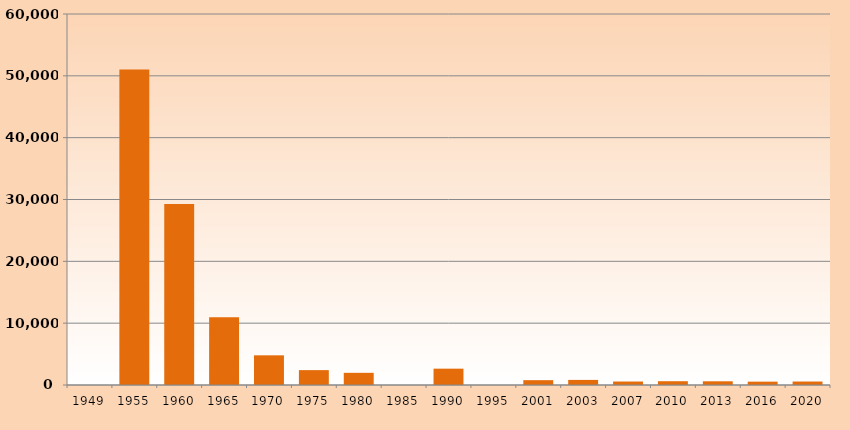
| Category | Series 1 |
|---|---|
| 1949.0 | 0 |
| 1955.0 | 51026 |
| 1960.0 | 29266 |
| 1965.0 | 10964 |
| 1970.0 | 4799 |
| 1975.0 | 2405 |
| 1980.0 | 1971 |
| 1985.0 | 0 |
| 1990.0 | 2642 |
| 1995.0 | 0 |
| 2001.0 | 781 |
| 2003.0 | 823 |
| 2007.0 | 561 |
| 2010.0 | 612 |
| 2013.0 | 600 |
| 2016.0 | 541 |
| 2020.0 | 561 |